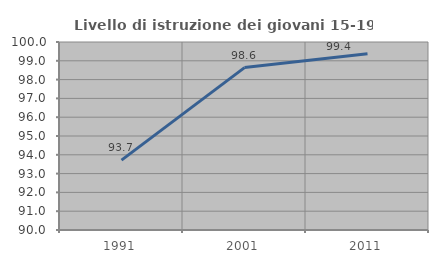
| Category | Livello di istruzione dei giovani 15-19 anni |
|---|---|
| 1991.0 | 93.717 |
| 2001.0 | 98.639 |
| 2011.0 | 99.375 |